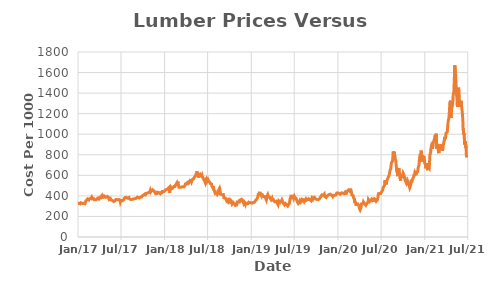
| Category | Series 1 |
|---|---|
| 2021-06-25 | 774 |
| 2021-06-24 | 837 |
| 2021-06-23 | 879 |
| 2021-06-22 | 866.4 |
| 2021-06-21 | 932.5 |
| 2021-06-18 | 897.9 |
| 2021-06-17 | 904.9 |
| 2021-06-16 | 967.9 |
| 2021-06-15 | 1009.9 |
| 2021-06-14 | 996.2 |
| 2021-06-11 | 1059.2 |
| 2021-06-10 | 1122.2 |
| 2021-06-09 | 1164.2 |
| 2021-06-08 | 1167 |
| 2021-06-07 | 1221.2 |
| 2021-06-04 | 1284.2 |
| 2021-06-03 | 1326.2 |
| 2021-06-02 | 1330.5 |
| 2021-06-01 | 1267.5 |
| 2021-05-28 | 1309.5 |
| 2021-05-27 | 1323 |
| 2021-05-26 | 1339.4 |
| 2021-05-25 | 1397 |
| 2021-05-24 | 1439 |
| 2021-05-21 | 1453 |
| 2021-05-20 | 1390 |
| 2021-05-19 | 1327 |
| 2021-05-18 | 1264 |
| 2021-05-17 | 1327 |
| 2021-05-14 | 1390 |
| 2021-05-13 | 1453 |
| 2021-05-12 | 1495 |
| 2021-05-11 | 1544.5 |
| 2021-05-10 | 1607.5 |
| 2021-05-07 | 1670.5 |
| 2021-05-06 | 1607.5 |
| 2021-05-05 | 1544.5 |
| 2021-05-04 | 1481.5 |
| 2021-05-03 | 1418.5 |
| 2021-04-30 | 1376.5 |
| 2021-04-29 | 1328.5 |
| 2021-04-28 | 1296.5 |
| 2021-04-27 | 1281 |
| 2021-04-26 | 1286.6 |
| 2021-04-23 | 1238.6 |
| 2021-04-22 | 1190.6 |
| 2021-04-21 | 1158.6 |
| 2021-04-20 | 1278.7 |
| 2021-04-19 | 1326.7 |
| 2021-04-16 | 1294.7 |
| 2021-04-15 | 1260.7 |
| 2021-04-14 | 1212.7 |
| 2021-04-13 | 1180.7 |
| 2021-04-12 | 1157.5 |
| 2021-04-09 | 1125.5 |
| 2021-04-08 | 1106.4 |
| 2021-04-07 | 1074.4 |
| 2021-04-06 | 1044.3 |
| 2021-04-05 | 1021 |
| 2021-04-01 | 1012.6 |
| 2021-03-31 | 1009.1 |
| 2021-03-30 | 989.6 |
| 2021-03-29 | 965.2 |
| 2021-03-26 | 953 |
| 2021-03-25 | 973.5 |
| 2021-03-24 | 945.8 |
| 2021-03-23 | 942.4 |
| 2021-03-22 | 926.2 |
| 2021-03-19 | 886.6 |
| 2021-03-18 | 854.6 |
| 2021-03-17 | 854.2 |
| 2021-03-16 | 840 |
| 2021-03-15 | 862.5 |
| 2021-03-12 | 867.1 |
| 2021-03-11 | 872 |
| 2021-03-10 | 903.7 |
| 2021-03-09 | 909.1 |
| 2021-03-08 | 878.9 |
| 2021-03-05 | 880 |
| 2021-03-04 | 866 |
| 2021-03-03 | 844.7 |
| 2021-03-02 | 836.1 |
| 2021-03-01 | 815.7 |
| 2021-02-26 | 847.7 |
| 2021-02-25 | 878.3 |
| 2021-02-24 | 906.4 |
| 2021-02-23 | 890.1 |
| 2021-02-22 | 890.2 |
| 2021-02-19 | 858.2 |
| 2021-02-18 | 1004.5 |
| 2021-02-17 | 986.8 |
| 2021-02-16 | 992.4 |
| 2021-02-12 | 982.1 |
| 2021-02-11 | 979 |
| 2021-02-10 | 950.8 |
| 2021-02-09 | 947 |
| 2021-02-08 | 940 |
| 2021-02-05 | 915.6 |
| 2021-02-04 | 883.6 |
| 2021-02-03 | 884 |
| 2021-02-02 | 857.4 |
| 2021-02-01 | 870.8 |
| 2021-01-29 | 887 |
| 2021-01-28 | 892.6 |
| 2021-01-27 | 865 |
| 2021-01-26 | 855.1 |
| 2021-01-25 | 823.1 |
| 2021-01-22 | 796 |
| 2021-01-21 | 748 |
| 2021-01-20 | 700 |
| 2021-01-19 | 668 |
| 2021-01-15 | 662.9 |
| 2021-01-14 | 683 |
| 2021-01-13 | 671.5 |
| 2021-01-12 | 649.9 |
| 2021-01-11 | 666.7 |
| 2021-01-08 | 690 |
| 2021-01-07 | 718 |
| 2021-01-06 | 703.3 |
| 2021-01-05 | 668.6 |
| 2021-01-04 | 700.6 |
| 2020-12-31 | 716.9 |
| 2020-12-30 | 745 |
| 2020-12-29 | 777 |
| 2020-12-28 | 775 |
| 2020-12-24 | 783.8 |
| 2020-12-23 | 772.4 |
| 2020-12-22 | 783.8 |
| 2020-12-21 | 766.2 |
| 2020-12-18 | 734.2 |
| 2020-12-17 | 840.1 |
| 2020-12-16 | 818.6 |
| 2020-12-15 | 826 |
| 2020-12-14 | 813 |
| 2020-12-11 | 795 |
| 2020-12-10 | 786.5 |
| 2020-12-09 | 754.5 |
| 2020-12-08 | 725.2 |
| 2020-12-07 | 696.8 |
| 2020-12-04 | 678.6 |
| 2020-12-03 | 660 |
| 2020-12-02 | 649 |
| 2020-12-01 | 635.2 |
| 2020-11-30 | 636.8 |
| 2020-11-27 | 630.9 |
| 2020-11-25 | 617.1 |
| 2020-11-24 | 600.5 |
| 2020-11-23 | 618.4 |
| 2020-11-20 | 630.1 |
| 2020-11-19 | 616.9 |
| 2020-11-18 | 595.7 |
| 2020-11-17 | 610.6 |
| 2020-11-16 | 593.5 |
| 2020-11-13 | 578.3 |
| 2020-11-12 | 576.3 |
| 2020-11-11 | 572.3 |
| 2020-11-10 | 580.3 |
| 2020-11-09 | 556.8 |
| 2020-11-06 | 524.8 |
| 2020-11-05 | 555.7 |
| 2020-11-04 | 539.1 |
| 2020-11-03 | 526.1 |
| 2020-11-02 | 502.8 |
| 2020-10-30 | 493.4 |
| 2020-10-29 | 478.3 |
| 2020-10-28 | 482.4 |
| 2020-10-27 | 484 |
| 2020-10-26 | 503 |
| 2020-10-23 | 515.3 |
| 2020-10-22 | 531.4 |
| 2020-10-21 | 522 |
| 2020-10-20 | 531.7 |
| 2020-10-19 | 550.7 |
| 2020-10-16 | 534 |
| 2020-10-15 | 537.7 |
| 2020-10-14 | 548.9 |
| 2020-10-13 | 535.4 |
| 2020-10-12 | 535.8 |
| 2020-10-09 | 557.3 |
| 2020-10-08 | 586.3 |
| 2020-10-07 | 567.3 |
| 2020-10-06 | 583.1 |
| 2020-10-05 | 602.1 |
| 2020-10-02 | 603 |
| 2020-10-01 | 622 |
| 2020-09-30 | 612.2 |
| 2020-09-29 | 602.2 |
| 2020-09-28 | 578.6 |
| 2020-09-25 | 607.6 |
| 2020-09-24 | 578.6 |
| 2020-09-23 | 607.6 |
| 2020-09-22 | 578.6 |
| 2020-09-21 | 549.6 |
| 2020-09-18 | 578.6 |
| 2020-09-17 | 597.6 |
| 2020-09-16 | 612 |
| 2020-09-15 | 640.4 |
| 2020-09-14 | 669.4 |
| 2020-09-11 | 640.4 |
| 2020-09-10 | 611.4 |
| 2020-09-09 | 592.4 |
| 2020-09-08 | 612.5 |
| 2020-09-04 | 641.5 |
| 2020-09-03 | 670.5 |
| 2020-09-02 | 699.5 |
| 2020-09-01 | 728.5 |
| 2020-08-31 | 747.5 |
| 2020-08-28 | 766.5 |
| 2020-08-27 | 794.8 |
| 2020-08-26 | 765.8 |
| 2020-08-25 | 829.3 |
| 2020-08-24 | 810.3 |
| 2020-08-21 | 830.9 |
| 2020-08-20 | 801.9 |
| 2020-08-19 | 782.9 |
| 2020-08-18 | 754 |
| 2020-08-17 | 735 |
| 2020-08-14 | 726.5 |
| 2020-08-13 | 725 |
| 2020-08-12 | 706 |
| 2020-08-11 | 681.5 |
| 2020-08-10 | 662.5 |
| 2020-08-07 | 648 |
| 2020-08-06 | 641.6 |
| 2020-08-05 | 622.6 |
| 2020-08-04 | 610.9 |
| 2020-08-03 | 596.2 |
| 2020-07-31 | 585.8 |
| 2020-07-30 | 580.4 |
| 2020-07-29 | 585 |
| 2020-07-28 | 566.9 |
| 2020-07-27 | 567.9 |
| 2020-07-24 | 541.4 |
| 2020-07-23 | 522.4 |
| 2020-07-22 | 510.5 |
| 2020-07-21 | 513.2 |
| 2020-07-20 | 532.2 |
| 2020-07-17 | 550.8 |
| 2020-07-16 | 524.2 |
| 2020-07-15 | 505.2 |
| 2020-07-14 | 511.5 |
| 2020-07-13 | 493.7 |
| 2020-07-10 | 498.4 |
| 2020-07-09 | 481.9 |
| 2020-07-08 | 469.4 |
| 2020-07-07 | 455.3 |
| 2020-07-06 | 453.2 |
| 2020-07-02 | 438.3 |
| 2020-07-01 | 432 |
| 2020-06-30 | 431.6 |
| 2020-06-29 | 423.4 |
| 2020-06-26 | 424.1 |
| 2020-06-25 | 429.5 |
| 2020-06-24 | 424.1 |
| 2020-06-23 | 433.7 |
| 2020-06-22 | 424.1 |
| 2020-06-19 | 421.4 |
| 2020-06-18 | 401.3 |
| 2020-06-17 | 382.3 |
| 2020-06-16 | 373.4 |
| 2020-06-15 | 361.3 |
| 2020-06-12 | 354.6 |
| 2020-06-11 | 351 |
| 2020-06-10 | 362 |
| 2020-06-09 | 357.6 |
| 2020-06-08 | 370.8 |
| 2020-06-05 | 368.8 |
| 2020-06-04 | 356.2 |
| 2020-06-03 | 348.1 |
| 2020-06-02 | 357 |
| 2020-06-01 | 362.3 |
| 2020-05-29 | 367.1 |
| 2020-05-28 | 368.3 |
| 2020-05-27 | 359.9 |
| 2020-05-26 | 356.8 |
| 2020-05-22 | 367.5 |
| 2020-05-21 | 370.3 |
| 2020-05-20 | 367.5 |
| 2020-05-19 | 354.3 |
| 2020-05-18 | 346.2 |
| 2020-05-15 | 345 |
| 2020-05-14 | 344.6 |
| 2020-05-13 | 348.5 |
| 2020-05-12 | 341 |
| 2020-05-11 | 353.8 |
| 2020-05-08 | 365 |
| 2020-05-07 | 346.1 |
| 2020-05-06 | 341.5 |
| 2020-05-05 | 336.2 |
| 2020-05-04 | 338.6 |
| 2020-05-01 | 328.5 |
| 2020-04-30 | 321.6 |
| 2020-04-29 | 312.5 |
| 2020-04-28 | 319.3 |
| 2020-04-27 | 308.4 |
| 2020-04-24 | 313 |
| 2020-04-23 | 317 |
| 2020-04-22 | 323 |
| 2020-04-21 | 317.5 |
| 2020-04-20 | 328.6 |
| 2020-04-17 | 341.7 |
| 2020-04-16 | 332.6 |
| 2020-04-15 | 324 |
| 2020-04-14 | 331 |
| 2020-04-13 | 333.7 |
| 2020-04-09 | 322.1 |
| 2020-04-08 | 304.1 |
| 2020-04-07 | 307.4 |
| 2020-04-06 | 282 |
| 2020-04-03 | 264 |
| 2020-04-02 | 264.1 |
| 2020-04-01 | 259.8 |
| 2020-03-31 | 278.5 |
| 2020-03-30 | 296.5 |
| 2020-03-27 | 311.3 |
| 2020-03-26 | 320.8 |
| 2020-03-25 | 311.6 |
| 2020-03-24 | 321.5 |
| 2020-03-23 | 320.2 |
| 2020-03-20 | 322.3 |
| 2020-03-19 | 319.8 |
| 2020-03-18 | 303.4 |
| 2020-03-17 | 310 |
| 2020-03-16 | 325 |
| 2020-03-13 | 343 |
| 2020-03-12 | 331 |
| 2020-03-11 | 349 |
| 2020-03-10 | 364.8 |
| 2020-03-09 | 356.7 |
| 2020-03-06 | 383.7 |
| 2020-03-05 | 401.7 |
| 2020-03-04 | 410.8 |
| 2020-03-03 | 406.3 |
| 2020-03-02 | 410.9 |
| 2020-02-28 | 410.9 |
| 2020-02-27 | 428 |
| 2020-02-26 | 445 |
| 2020-02-25 | 451.8 |
| 2020-02-24 | 459.5 |
| 2020-02-21 | 460.1 |
| 2020-02-20 | 463 |
| 2020-02-19 | 460.3 |
| 2020-02-18 | 446.1 |
| 2020-02-14 | 449.3 |
| 2020-02-13 | 455.1 |
| 2020-02-12 | 454.5 |
| 2020-02-11 | 451.4 |
| 2020-02-10 | 446 |
| 2020-02-07 | 440.2 |
| 2020-02-06 | 433.2 |
| 2020-02-05 | 428.3 |
| 2020-02-04 | 412.7 |
| 2020-02-03 | 422.8 |
| 2020-01-31 | 435.5 |
| 2020-01-30 | 436.1 |
| 2020-01-29 | 428 |
| 2020-01-28 | 427.1 |
| 2020-01-27 | 420.8 |
| 2020-01-24 | 426.2 |
| 2020-01-23 | 426 |
| 2020-01-22 | 425.2 |
| 2020-01-21 | 424.7 |
| 2020-01-17 | 430 |
| 2020-01-16 | 428.8 |
| 2020-01-15 | 426.5 |
| 2020-01-14 | 420.4 |
| 2020-01-13 | 422.6 |
| 2020-01-10 | 416.2 |
| 2020-01-09 | 416 |
| 2020-01-08 | 422.9 |
| 2020-01-07 | 418.3 |
| 2020-01-06 | 420.5 |
| 2020-01-03 | 427.6 |
| 2020-01-02 | 431.8 |
| 2019-12-31 | 426.2 |
| 2019-12-30 | 427.8 |
| 2019-12-27 | 427.9 |
| 2019-12-26 | 422.3 |
| 2019-12-24 | 420.9 |
| 2019-12-23 | 408.6 |
| 2019-12-20 | 413.3 |
| 2019-12-19 | 417.2 |
| 2019-12-18 | 406.8 |
| 2019-12-17 | 406.4 |
| 2019-12-16 | 410.8 |
| 2019-12-13 | 404.6 |
| 2019-12-12 | 397.8 |
| 2019-12-11 | 396.6 |
| 2019-12-10 | 392.7 |
| 2019-12-09 | 399.4 |
| 2019-12-06 | 406.1 |
| 2019-12-05 | 405.3 |
| 2019-12-04 | 400.7 |
| 2019-12-03 | 397.8 |
| 2019-12-02 | 409 |
| 2019-11-29 | 416.6 |
| 2019-11-27 | 416.1 |
| 2019-11-26 | 412.9 |
| 2019-11-25 | 421.3 |
| 2019-11-22 | 410.4 |
| 2019-11-21 | 408.2 |
| 2019-11-20 | 402.7 |
| 2019-11-19 | 413.4 |
| 2019-11-18 | 413 |
| 2019-11-15 | 396.4 |
| 2019-11-14 | 398.7 |
| 2019-11-13 | 387.9 |
| 2019-11-12 | 384.8 |
| 2019-11-11 | 391.7 |
| 2019-11-08 | 393 |
| 2019-11-07 | 393.3 |
| 2019-11-06 | 396 |
| 2019-11-05 | 405.1 |
| 2019-11-04 | 417.4 |
| 2019-11-01 | 412.8 |
| 2019-10-31 | 405.8 |
| 2019-10-30 | 407.1 |
| 2019-10-29 | 410 |
| 2019-10-28 | 406.9 |
| 2019-10-25 | 410 |
| 2019-10-24 | 403.7 |
| 2019-10-23 | 400.6 |
| 2019-10-22 | 395.8 |
| 2019-10-21 | 397.6 |
| 2019-10-18 | 385.6 |
| 2019-10-17 | 389.6 |
| 2019-10-16 | 379.9 |
| 2019-10-15 | 372.7 |
| 2019-10-14 | 380.5 |
| 2019-10-11 | 369.4 |
| 2019-10-10 | 363 |
| 2019-10-09 | 366.3 |
| 2019-10-08 | 362 |
| 2019-10-07 | 368.7 |
| 2019-10-04 | 365.7 |
| 2019-10-03 | 364.2 |
| 2019-10-02 | 359.8 |
| 2019-10-01 | 361.7 |
| 2019-09-30 | 367.1 |
| 2019-09-27 | 371.6 |
| 2019-09-26 | 372 |
| 2019-09-25 | 369.2 |
| 2019-09-24 | 373 |
| 2019-09-23 | 387.2 |
| 2019-09-20 | 383.8 |
| 2019-09-19 | 378.3 |
| 2019-09-18 | 382 |
| 2019-09-17 | 376.3 |
| 2019-09-16 | 367.6 |
| 2019-09-13 | 378.5 |
| 2019-09-12 | 380.5 |
| 2019-09-11 | 380.6 |
| 2019-09-10 | 372 |
| 2019-09-09 | 353 |
| 2019-09-06 | 353.6 |
| 2019-09-05 | 358.8 |
| 2019-09-04 | 362.3 |
| 2019-09-03 | 368.9 |
| 2019-08-30 | 372 |
| 2019-08-29 | 373.2 |
| 2019-08-28 | 379.3 |
| 2019-08-27 | 368.2 |
| 2019-08-26 | 363.3 |
| 2019-08-23 | 359.9 |
| 2019-08-22 | 359.3 |
| 2019-08-21 | 369.1 |
| 2019-08-20 | 366.2 |
| 2019-08-19 | 371.9 |
| 2019-08-16 | 362.9 |
| 2019-08-15 | 354.2 |
| 2019-08-14 | 348.1 |
| 2019-08-13 | 354.2 |
| 2019-08-12 | 342.8 |
| 2019-08-09 | 348.9 |
| 2019-08-08 | 363.6 |
| 2019-08-07 | 358 |
| 2019-08-06 | 369.6 |
| 2019-08-05 | 358 |
| 2019-08-02 | 368 |
| 2019-08-01 | 362.9 |
| 2019-07-31 | 343.9 |
| 2019-07-30 | 349 |
| 2019-07-29 | 335.8 |
| 2019-07-26 | 333.7 |
| 2019-07-25 | 340.1 |
| 2019-07-24 | 343.5 |
| 2019-07-23 | 332.7 |
| 2019-07-22 | 344 |
| 2019-07-19 | 353.7 |
| 2019-07-18 | 334.7 |
| 2019-07-17 | 327.1 |
| 2019-07-16 | 332.4 |
| 2019-07-15 | 336.6 |
| 2019-07-12 | 348.6 |
| 2019-07-11 | 355.8 |
| 2019-07-10 | 367 |
| 2019-07-09 | 368.7 |
| 2019-07-08 | 377.2 |
| 2019-07-05 | 383.9 |
| 2019-07-03 | 383.2 |
| 2019-07-02 | 391.1 |
| 2019-07-01 | 394.1 |
| 2019-06-28 | 375.1 |
| 2019-06-27 | 378.7 |
| 2019-06-26 | 383.9 |
| 2019-06-25 | 393.8 |
| 2019-06-24 | 392.1 |
| 2019-06-21 | 403.2 |
| 2019-06-20 | 384.2 |
| 2019-06-19 | 386.3 |
| 2019-06-18 | 410 |
| 2019-06-17 | 392.3 |
| 2019-06-14 | 386 |
| 2019-06-13 | 373.8 |
| 2019-06-12 | 354.8 |
| 2019-06-11 | 343.3 |
| 2019-06-10 | 324.3 |
| 2019-06-07 | 315.8 |
| 2019-06-06 | 314.4 |
| 2019-06-05 | 311.6 |
| 2019-06-04 | 316.4 |
| 2019-06-03 | 301.8 |
| 2019-05-31 | 305.5 |
| 2019-05-30 | 309.3 |
| 2019-05-29 | 316.2 |
| 2019-05-28 | 307.5 |
| 2019-05-24 | 326.5 |
| 2019-05-23 | 323.7 |
| 2019-05-22 | 319 |
| 2019-05-21 | 317.9 |
| 2019-05-20 | 313.6 |
| 2019-05-17 | 324 |
| 2019-05-16 | 328.1 |
| 2019-05-15 | 326.2 |
| 2019-05-14 | 335.9 |
| 2019-05-13 | 343.5 |
| 2019-05-10 | 358.5 |
| 2019-05-09 | 358.5 |
| 2019-05-08 | 346.1 |
| 2019-05-07 | 341.8 |
| 2019-05-06 | 347.9 |
| 2019-05-03 | 349.3 |
| 2019-05-02 | 348.5 |
| 2019-05-01 | 338 |
| 2019-04-30 | 343.7 |
| 2019-04-29 | 342.7 |
| 2019-04-26 | 350.7 |
| 2019-04-25 | 343.8 |
| 2019-04-24 | 330.1 |
| 2019-04-23 | 314.9 |
| 2019-04-22 | 323.6 |
| 2019-04-18 | 335.7 |
| 2019-04-17 | 338.9 |
| 2019-04-16 | 335.8 |
| 2019-04-15 | 348 |
| 2019-04-12 | 348.7 |
| 2019-04-11 | 340.3 |
| 2019-04-10 | 342.4 |
| 2019-04-09 | 340 |
| 2019-04-08 | 345.5 |
| 2019-04-05 | 352.8 |
| 2019-04-04 | 360.3 |
| 2019-04-03 | 365.2 |
| 2019-04-02 | 359.9 |
| 2019-04-01 | 365.7 |
| 2019-03-29 | 360.2 |
| 2019-03-28 | 374.9 |
| 2019-03-27 | 366.6 |
| 2019-03-26 | 369.2 |
| 2019-03-25 | 363 |
| 2019-03-22 | 368.3 |
| 2019-03-21 | 378.4 |
| 2019-03-20 | 381.1 |
| 2019-03-19 | 385.5 |
| 2019-03-18 | 390.6 |
| 2019-03-15 | 390.2 |
| 2019-03-14 | 386.8 |
| 2019-03-13 | 395.8 |
| 2019-03-12 | 399.3 |
| 2019-03-11 | 411.8 |
| 2019-03-08 | 396.8 |
| 2019-03-07 | 381.8 |
| 2019-03-06 | 370.5 |
| 2019-03-05 | 360.1 |
| 2019-03-04 | 367.4 |
| 2019-03-01 | 382.4 |
| 2019-02-28 | 391.4 |
| 2019-02-27 | 390.6 |
| 2019-02-26 | 393.2 |
| 2019-02-25 | 395.4 |
| 2019-02-22 | 393.5 |
| 2019-02-21 | 394.3 |
| 2019-02-20 | 389 |
| 2019-02-19 | 397.4 |
| 2019-02-15 | 408.3 |
| 2019-02-14 | 423.3 |
| 2019-02-13 | 416.4 |
| 2019-02-12 | 401.4 |
| 2019-02-11 | 404.1 |
| 2019-02-08 | 419.1 |
| 2019-02-07 | 424.5 |
| 2019-02-06 | 439.5 |
| 2019-02-05 | 438.9 |
| 2019-02-04 | 423.9 |
| 2019-02-01 | 419.2 |
| 2019-01-31 | 416.2 |
| 2019-01-30 | 416.5 |
| 2019-01-29 | 401.5 |
| 2019-01-28 | 389.7 |
| 2019-01-25 | 381.5 |
| 2019-01-24 | 381.1 |
| 2019-01-23 | 366.1 |
| 2019-01-22 | 363.4 |
| 2019-01-18 | 354.9 |
| 2019-01-17 | 359.4 |
| 2019-01-16 | 361.5 |
| 2019-01-15 | 353.4 |
| 2019-01-14 | 338.4 |
| 2019-01-11 | 343.2 |
| 2019-01-10 | 346.4 |
| 2019-01-09 | 336.3 |
| 2019-01-08 | 340.2 |
| 2019-01-07 | 330.8 |
| 2019-01-04 | 329.9 |
| 2019-01-03 | 329.5 |
| 2019-01-02 | 333.2 |
| 2018-12-31 | 337 |
| 2018-12-28 | 334 |
| 2018-12-27 | 336.4 |
| 2018-12-26 | 336.2 |
| 2018-12-24 | 338.4 |
| 2018-12-21 | 339.3 |
| 2018-12-20 | 334.8 |
| 2018-12-19 | 335.8 |
| 2018-12-18 | 325.3 |
| 2018-12-17 | 320.7 |
| 2018-12-14 | 321.6 |
| 2018-12-13 | 323.2 |
| 2018-12-12 | 322.2 |
| 2018-12-11 | 316.4 |
| 2018-12-10 | 317.1 |
| 2018-12-07 | 331.9 |
| 2018-12-06 | 319.5 |
| 2018-12-04 | 321.8 |
| 2018-12-03 | 334.8 |
| 2018-11-30 | 323.9 |
| 2018-11-29 | 329.7 |
| 2018-11-28 | 336.7 |
| 2018-11-27 | 346.2 |
| 2018-11-26 | 355.7 |
| 2018-11-23 | 362.3 |
| 2018-11-21 | 365.7 |
| 2018-11-20 | 356 |
| 2018-11-19 | 358.5 |
| 2018-11-16 | 351.4 |
| 2018-11-15 | 366.4 |
| 2018-11-14 | 356.3 |
| 2018-11-13 | 341.3 |
| 2018-11-12 | 353 |
| 2018-11-09 | 358.4 |
| 2018-11-08 | 349.5 |
| 2018-11-07 | 340.8 |
| 2018-11-06 | 350.3 |
| 2018-11-05 | 344.4 |
| 2018-11-02 | 341 |
| 2018-11-01 | 326 |
| 2018-10-31 | 311 |
| 2018-10-30 | 302.4 |
| 2018-10-29 | 303.3 |
| 2018-10-26 | 306.8 |
| 2018-10-25 | 305.7 |
| 2018-10-24 | 303 |
| 2018-10-23 | 314.3 |
| 2018-10-22 | 320 |
| 2018-10-19 | 328.5 |
| 2018-10-18 | 325.9 |
| 2018-10-17 | 333.9 |
| 2018-10-16 | 339.9 |
| 2018-10-15 | 325.2 |
| 2018-10-12 | 320.1 |
| 2018-10-11 | 324.2 |
| 2018-10-10 | 339.2 |
| 2018-10-09 | 349 |
| 2018-10-08 | 353.5 |
| 2018-10-05 | 350.3 |
| 2018-10-04 | 361.4 |
| 2018-10-03 | 353.6 |
| 2018-10-02 | 346.3 |
| 2018-10-01 | 337.4 |
| 2018-09-28 | 344.4 |
| 2018-09-27 | 359.4 |
| 2018-09-26 | 351 |
| 2018-09-25 | 336.9 |
| 2018-09-24 | 339.6 |
| 2018-09-21 | 340.3 |
| 2018-09-20 | 345 |
| 2018-09-19 | 347.2 |
| 2018-09-18 | 348.1 |
| 2018-09-17 | 363.1 |
| 2018-09-14 | 370 |
| 2018-09-13 | 378.5 |
| 2018-09-12 | 373.9 |
| 2018-09-11 | 382.5 |
| 2018-09-10 | 383.3 |
| 2018-09-07 | 382.5 |
| 2018-09-06 | 397.5 |
| 2018-09-05 | 412.4 |
| 2018-09-04 | 419 |
| 2018-08-31 | 411.8 |
| 2018-08-30 | 402.6 |
| 2018-08-29 | 411.4 |
| 2018-08-28 | 420.4 |
| 2018-08-27 | 412.8 |
| 2018-08-24 | 415.2 |
| 2018-08-23 | 413.9 |
| 2018-08-22 | 458.6 |
| 2018-08-21 | 467.9 |
| 2018-08-20 | 475.8 |
| 2018-08-17 | 472.5 |
| 2018-08-16 | 457.5 |
| 2018-08-15 | 442.5 |
| 2018-08-14 | 444.9 |
| 2018-08-13 | 429.9 |
| 2018-08-10 | 414.9 |
| 2018-08-09 | 410.7 |
| 2018-08-08 | 411.4 |
| 2018-08-07 | 426.4 |
| 2018-08-06 | 422.7 |
| 2018-08-03 | 430.5 |
| 2018-08-02 | 425.4 |
| 2018-08-01 | 440.4 |
| 2018-07-31 | 455.4 |
| 2018-07-30 | 445.5 |
| 2018-07-27 | 463.3 |
| 2018-07-26 | 478.3 |
| 2018-07-25 | 493.3 |
| 2018-07-24 | 488.5 |
| 2018-07-23 | 477.3 |
| 2018-07-20 | 485.8 |
| 2018-07-19 | 484.9 |
| 2018-07-18 | 499.9 |
| 2018-07-17 | 514.9 |
| 2018-07-16 | 519.6 |
| 2018-07-13 | 520.7 |
| 2018-07-12 | 520.1 |
| 2018-07-11 | 521.8 |
| 2018-07-10 | 532.3 |
| 2018-07-09 | 530 |
| 2018-07-06 | 538.3 |
| 2018-07-05 | 541 |
| 2018-07-03 | 545.2 |
| 2018-07-02 | 557.5 |
| 2018-06-29 | 552.5 |
| 2018-06-28 | 540.8 |
| 2018-06-27 | 536.5 |
| 2018-06-26 | 545.8 |
| 2018-06-25 | 564.1 |
| 2018-06-22 | 560.1 |
| 2018-06-21 | 547 |
| 2018-06-20 | 532 |
| 2018-06-19 | 528.2 |
| 2018-06-18 | 543.2 |
| 2018-06-15 | 558.2 |
| 2018-06-14 | 566.3 |
| 2018-06-13 | 554.6 |
| 2018-06-12 | 569.6 |
| 2018-06-11 | 579.6 |
| 2018-06-08 | 589.6 |
| 2018-06-07 | 599.5 |
| 2018-06-06 | 592.7 |
| 2018-06-05 | 588.8 |
| 2018-06-04 | 588.4 |
| 2018-06-01 | 593.6 |
| 2018-05-31 | 597.1 |
| 2018-05-30 | 599.1 |
| 2018-05-29 | 609.1 |
| 2018-05-25 | 599.3 |
| 2018-05-24 | 589.3 |
| 2018-05-23 | 579.3 |
| 2018-05-22 | 594 |
| 2018-05-21 | 609 |
| 2018-05-18 | 624 |
| 2018-05-17 | 639 |
| 2018-05-16 | 629 |
| 2018-05-15 | 619 |
| 2018-05-14 | 612.7 |
| 2018-05-11 | 602.7 |
| 2018-05-10 | 592.7 |
| 2018-05-09 | 591.2 |
| 2018-05-08 | 592.4 |
| 2018-05-07 | 586.5 |
| 2018-05-04 | 576.5 |
| 2018-05-03 | 566.5 |
| 2018-05-02 | 575.1 |
| 2018-05-01 | 572.1 |
| 2018-04-30 | 562.1 |
| 2018-04-27 | 557.9 |
| 2018-04-26 | 552.2 |
| 2018-04-25 | 545.4 |
| 2018-04-24 | 556.6 |
| 2018-04-23 | 546.7 |
| 2018-04-20 | 548.6 |
| 2018-04-19 | 552.2 |
| 2018-04-18 | 550.7 |
| 2018-04-17 | 542.1 |
| 2018-04-16 | 535.8 |
| 2018-04-13 | 526.8 |
| 2018-04-12 | 524.3 |
| 2018-04-11 | 523.1 |
| 2018-04-10 | 533.1 |
| 2018-04-09 | 534.2 |
| 2018-04-06 | 536.2 |
| 2018-04-05 | 536.4 |
| 2018-04-04 | 526.4 |
| 2018-04-03 | 516.4 |
| 2018-04-02 | 512.7 |
| 2018-03-29 | 515.7 |
| 2018-03-28 | 505.9 |
| 2018-03-27 | 505.9 |
| 2018-03-26 | 497.1 |
| 2018-03-23 | 487.6 |
| 2018-03-22 | 484.8 |
| 2018-03-21 | 482.8 |
| 2018-03-20 | 489.7 |
| 2018-03-19 | 486.6 |
| 2018-03-16 | 489.1 |
| 2018-03-15 | 494.4 |
| 2018-03-14 | 484.4 |
| 2018-03-13 | 485.2 |
| 2018-03-12 | 486.4 |
| 2018-03-09 | 483.4 |
| 2018-03-08 | 477 |
| 2018-03-07 | 478.6 |
| 2018-03-06 | 488.6 |
| 2018-03-05 | 479.5 |
| 2018-03-02 | 483.8 |
| 2018-03-01 | 491.7 |
| 2018-02-28 | 501.7 |
| 2018-02-27 | 523 |
| 2018-02-26 | 515.1 |
| 2018-02-23 | 515.4 |
| 2018-02-22 | 515.9 |
| 2018-02-21 | 526.4 |
| 2018-02-20 | 516.8 |
| 2018-02-16 | 507.8 |
| 2018-02-15 | 500.7 |
| 2018-02-14 | 500.6 |
| 2018-02-13 | 491.5 |
| 2018-02-12 | 485.5 |
| 2018-02-09 | 483 |
| 2018-02-08 | 491.9 |
| 2018-02-07 | 493.7 |
| 2018-02-06 | 484 |
| 2018-02-05 | 477.9 |
| 2018-02-02 | 483.7 |
| 2018-02-01 | 475.1 |
| 2018-01-31 | 470.9 |
| 2018-01-30 | 467.8 |
| 2018-01-29 | 477.8 |
| 2018-01-26 | 487.3 |
| 2018-01-25 | 478 |
| 2018-01-24 | 472.9 |
| 2018-01-23 | 471.9 |
| 2018-01-22 | 428.9 |
| 2018-01-19 | 429.8 |
| 2018-01-18 | 479.5 |
| 2018-01-17 | 476.4 |
| 2018-01-16 | 474.7 |
| 2018-01-12 | 466.1 |
| 2018-01-11 | 463.8 |
| 2018-01-10 | 460.7 |
| 2018-01-09 | 456.7 |
| 2018-01-08 | 459.9 |
| 2018-01-05 | 459.1 |
| 2018-01-04 | 454.1 |
| 2018-01-03 | 452.6 |
| 2018-01-02 | 449.5 |
| 2017-12-29 | 441.9 |
| 2017-12-28 | 444.1 |
| 2017-12-27 | 444.4 |
| 2017-12-26 | 444.4 |
| 2017-12-22 | 442.8 |
| 2017-12-21 | 435.9 |
| 2017-12-20 | 430.6 |
| 2017-12-19 | 431.2 |
| 2017-12-18 | 434.9 |
| 2017-12-15 | 431.9 |
| 2017-12-14 | 430.7 |
| 2017-12-13 | 421.1 |
| 2017-12-12 | 423.5 |
| 2017-12-11 | 429.9 |
| 2017-12-08 | 429.7 |
| 2017-12-07 | 425.9 |
| 2017-12-06 | 424.4 |
| 2017-12-05 | 422.5 |
| 2017-12-04 | 432.5 |
| 2017-12-01 | 435.4 |
| 2017-11-30 | 427.7 |
| 2017-11-29 | 421.8 |
| 2017-11-28 | 426.2 |
| 2017-11-27 | 416.2 |
| 2017-11-24 | 420.7 |
| 2017-11-22 | 427.5 |
| 2017-11-21 | 431.3 |
| 2017-11-20 | 429.7 |
| 2017-11-17 | 439.7 |
| 2017-11-16 | 449.7 |
| 2017-11-15 | 449.4 |
| 2017-11-14 | 452.5 |
| 2017-11-13 | 456.3 |
| 2017-11-10 | 459.6 |
| 2017-11-09 | 455.4 |
| 2017-11-08 | 455.8 |
| 2017-11-07 | 457.1 |
| 2017-11-06 | 449.6 |
| 2017-11-03 | 439.6 |
| 2017-11-02 | 443.6 |
| 2017-11-01 | 453.6 |
| 2017-10-31 | 444 |
| 2017-10-30 | 438.7 |
| 2017-10-27 | 444.2 |
| 2017-10-26 | 435.3 |
| 2017-10-25 | 432.6 |
| 2017-10-24 | 433.7 |
| 2017-10-23 | 435.6 |
| 2017-10-20 | 427.5 |
| 2017-10-19 | 426.7 |
| 2017-10-18 | 423.7 |
| 2017-10-17 | 428.5 |
| 2017-10-16 | 429.8 |
| 2017-10-13 | 424.3 |
| 2017-10-12 | 417.2 |
| 2017-10-11 | 409.2 |
| 2017-10-10 | 407.3 |
| 2017-10-09 | 413.7 |
| 2017-10-06 | 412.1 |
| 2017-10-05 | 408.9 |
| 2017-10-04 | 408.8 |
| 2017-10-03 | 410.4 |
| 2017-10-02 | 406.8 |
| 2017-09-29 | 402.2 |
| 2017-09-28 | 402.4 |
| 2017-09-27 | 393.5 |
| 2017-09-26 | 388.9 |
| 2017-09-25 | 390 |
| 2017-09-22 | 393.1 |
| 2017-09-21 | 388.4 |
| 2017-09-20 | 390 |
| 2017-09-19 | 381.8 |
| 2017-09-18 | 379.2 |
| 2017-09-15 | 379.2 |
| 2017-09-14 | 378.9 |
| 2017-09-13 | 378.9 |
| 2017-09-12 | 376.1 |
| 2017-09-11 | 378.1 |
| 2017-09-08 | 388.1 |
| 2017-09-07 | 382.9 |
| 2017-09-06 | 379.3 |
| 2017-09-05 | 384.2 |
| 2017-09-01 | 374.2 |
| 2017-08-31 | 371.8 |
| 2017-08-30 | 366.3 |
| 2017-08-29 | 376.3 |
| 2017-08-28 | 380.1 |
| 2017-08-25 | 372 |
| 2017-08-24 | 373.9 |
| 2017-08-23 | 365.9 |
| 2017-08-22 | 367.6 |
| 2017-08-21 | 365.3 |
| 2017-08-18 | 366.3 |
| 2017-08-17 | 371.3 |
| 2017-08-16 | 370.3 |
| 2017-08-15 | 373.6 |
| 2017-08-14 | 370.3 |
| 2017-08-11 | 365.4 |
| 2017-08-10 | 365.5 |
| 2017-08-09 | 368 |
| 2017-08-08 | 368 |
| 2017-08-07 | 367.6 |
| 2017-08-04 | 373.8 |
| 2017-08-03 | 383.8 |
| 2017-08-02 | 384.7 |
| 2017-08-01 | 380.9 |
| 2017-07-31 | 378.3 |
| 2017-07-28 | 377.7 |
| 2017-07-27 | 381.4 |
| 2017-07-26 | 377.5 |
| 2017-07-25 | 377.2 |
| 2017-07-24 | 378.9 |
| 2017-07-21 | 386.7 |
| 2017-07-20 | 388.6 |
| 2017-07-19 | 388.8 |
| 2017-07-18 | 385.5 |
| 2017-07-17 | 387.3 |
| 2017-07-14 | 377.3 |
| 2017-07-13 | 367.4 |
| 2017-07-12 | 371.2 |
| 2017-07-11 | 369.1 |
| 2017-07-10 | 360.2 |
| 2017-07-07 | 352.8 |
| 2017-07-06 | 352.8 |
| 2017-07-05 | 354.4 |
| 2017-07-03 | 357.7 |
| 2017-06-30 | 356.1 |
| 2017-06-29 | 352.5 |
| 2017-06-28 | 342.5 |
| 2017-06-27 | 353.6 |
| 2017-06-26 | 360.9 |
| 2017-06-23 | 363.7 |
| 2017-06-22 | 363 |
| 2017-06-21 | 360.1 |
| 2017-06-20 | 363.6 |
| 2017-06-19 | 368.2 |
| 2017-06-16 | 363.4 |
| 2017-06-15 | 365.5 |
| 2017-06-14 | 368 |
| 2017-06-13 | 368.9 |
| 2017-06-12 | 370.2 |
| 2017-06-09 | 364.4 |
| 2017-06-08 | 363.6 |
| 2017-06-07 | 357.9 |
| 2017-06-06 | 355 |
| 2017-06-05 | 351.6 |
| 2017-06-02 | 353.5 |
| 2017-06-01 | 353.2 |
| 2017-05-31 | 345.1 |
| 2017-05-30 | 346.8 |
| 2017-05-26 | 354.2 |
| 2017-05-25 | 353 |
| 2017-05-24 | 361.6 |
| 2017-05-23 | 362.7 |
| 2017-05-22 | 363.3 |
| 2017-05-19 | 363 |
| 2017-05-18 | 367.7 |
| 2017-05-17 | 373.7 |
| 2017-05-16 | 371.7 |
| 2017-05-15 | 373.4 |
| 2017-05-12 | 364.2 |
| 2017-05-11 | 372.6 |
| 2017-05-10 | 374.4 |
| 2017-05-09 | 384.4 |
| 2017-05-08 | 387.5 |
| 2017-05-05 | 388.8 |
| 2017-05-04 | 395.1 |
| 2017-05-03 | 390.1 |
| 2017-05-02 | 390.8 |
| 2017-05-01 | 392.2 |
| 2017-04-28 | 386.1 |
| 2017-04-27 | 386 |
| 2017-04-26 | 385 |
| 2017-04-25 | 392.9 |
| 2017-04-24 | 395.1 |
| 2017-04-21 | 398.5 |
| 2017-04-20 | 388.8 |
| 2017-04-19 | 387.4 |
| 2017-04-18 | 385 |
| 2017-04-17 | 386.7 |
| 2017-04-13 | 385 |
| 2017-04-12 | 393.5 |
| 2017-04-11 | 403.5 |
| 2017-04-10 | 393.8 |
| 2017-04-07 | 399.6 |
| 2017-04-06 | 389.6 |
| 2017-04-05 | 379.6 |
| 2017-04-04 | 373.1 |
| 2017-04-03 | 374 |
| 2017-03-31 | 381.4 |
| 2017-03-30 | 375.4 |
| 2017-03-29 | 369.2 |
| 2017-03-28 | 369.2 |
| 2017-03-27 | 372.6 |
| 2017-03-24 | 376.6 |
| 2017-03-23 | 376.7 |
| 2017-03-22 | 373.3 |
| 2017-03-21 | 370.2 |
| 2017-03-20 | 371 |
| 2017-03-17 | 361.8 |
| 2017-03-16 | 363.5 |
| 2017-03-15 | 365.5 |
| 2017-03-14 | 359.5 |
| 2017-03-13 | 359.7 |
| 2017-03-10 | 362.5 |
| 2017-03-09 | 361.5 |
| 2017-03-08 | 369.6 |
| 2017-03-07 | 374.4 |
| 2017-03-06 | 371.6 |
| 2017-03-03 | 370.6 |
| 2017-03-02 | 370.4 |
| 2017-03-01 | 374.9 |
| 2017-02-28 | 378.8 |
| 2017-02-27 | 388.5 |
| 2017-02-24 | 379.6 |
| 2017-02-23 | 375.5 |
| 2017-02-22 | 375.2 |
| 2017-02-21 | 372 |
| 2017-02-17 | 371.1 |
| 2017-02-16 | 371.1 |
| 2017-02-15 | 361.3 |
| 2017-02-14 | 365.7 |
| 2017-02-13 | 365.4 |
| 2017-02-10 | 370.5 |
| 2017-02-09 | 375.4 |
| 2017-02-08 | 371.9 |
| 2017-02-07 | 361.9 |
| 2017-02-06 | 360.1 |
| 2017-02-03 | 350.6 |
| 2017-02-02 | 347.9 |
| 2017-02-01 | 337.9 |
| 2017-01-31 | 330 |
| 2017-01-30 | 324.2 |
| 2017-01-27 | 328.4 |
| 2017-01-26 | 332 |
| 2017-01-25 | 328.7 |
| 2017-01-24 | 320.8 |
| 2017-01-23 | 321.5 |
| 2017-01-20 | 325.5 |
| 2017-01-19 | 325.6 |
| 2017-01-18 | 326.8 |
| 2017-01-17 | 334.7 |
| 2017-01-13 | 333.3 |
| 2017-01-12 | 326.8 |
| 2017-01-11 | 328.8 |
| 2017-01-10 | 322.6 |
| 2017-01-09 | 322.1 |
| 2017-01-06 | 328.2 |
| 2017-01-05 | 328.6 |
| 2017-01-04 | 327.9 |
| 2017-01-03 | 329.1 |
| 2016-12-30 | 329.4 |
| 2016-12-29 | 324.5 |
| 2016-12-28 | 322.5 |
| 2016-12-27 | 316.3 |
| 2016-12-23 | 318.6 |
| 2016-12-22 | 318.2 |
| 2016-12-21 | 320.3 |
| 2016-12-20 | 319.9 |
| 2016-12-19 | 316.9 |
| 2016-12-16 | 309.3 |
| 2016-12-15 | 321.6 |
| 2016-12-14 | 313.5 |
| 2016-12-13 | 316 |
| 2016-12-12 | 315.5 |
| 2016-12-09 | 317.3 |
| 2016-12-08 | 322.8 |
| 2016-12-07 | 328.7 |
| 2016-12-06 | 331.4 |
| 2016-12-05 | 332.9 |
| 2016-12-02 | 337.2 |
| 2016-12-01 | 331.1 |
| 2016-11-30 | 329.8 |
| 2016-11-29 | 330.3 |
| 2016-11-28 | 337.9 |
| 2016-11-25 | 334.4 |
| 2016-11-23 | 324.4 |
| 2016-11-22 | 322.5 |
| 2016-11-21 | 321.5 |
| 2016-11-18 | 320.7 |
| 2016-11-17 | 323.1 |
| 2016-11-16 | 315.6 |
| 2016-11-15 | 312.9 |
| 2016-11-14 | 313.4 |
| 2016-11-11 | 319.8 |
| 2016-11-10 | 316.7 |
| 2016-11-09 | 316 |
| 2016-11-08 | 311.2 |
| 2016-11-07 | 311.9 |
| 2016-11-04 | 312.2 |
| 2016-11-03 | 311.1 |
| 2016-11-02 | 308.5 |
| 2016-11-01 | 308.3 |
| 2016-10-31 | 309.2 |
| 2016-10-28 | 311.1 |
| 2016-10-27 | 315.1 |
| 2016-10-26 | 316.7 |
| 2016-10-25 | 318.8 |
| 2016-10-24 | 319.6 |
| 2016-10-21 | 320.2 |
| 2016-10-20 | 321.7 |
| 2016-10-19 | 326.6 |
| 2016-10-18 | 322.7 |
| 2016-10-17 | 315 |
| 2016-10-14 | 323.4 |
| 2016-10-13 | 328 |
| 2016-10-12 | 334.6 |
| 2016-10-11 | 332.3 |
| 2016-10-10 | 342.3 |
| 2016-10-07 | 343.1 |
| 2016-10-06 | 336 |
| 2016-10-05 | 331.7 |
| 2016-10-04 | 330.3 |
| 2016-10-03 | 334.9 |
| 2016-09-30 | 336.4 |
| 2016-09-29 | 330.1 |
| 2016-09-28 | 325.6 |
| 2016-09-27 | 326.2 |
| 2016-09-26 | 327.1 |
| 2016-09-23 | 327.1 |
| 2016-09-22 | 325.4 |
| 2016-09-21 | 315.4 |
| 2016-09-20 | 306.3 |
| 2016-09-19 | 305.6 |
| 2016-09-16 | 303.9 |
| 2016-09-15 | 301 |
| 2016-09-14 | 307.6 |
| 2016-09-13 | 307.8 |
| 2016-09-12 | 311.4 |
| 2016-09-09 | 309.4 |
| 2016-09-08 | 308.2 |
| 2016-09-07 | 311.4 |
| 2016-09-06 | 313.6 |
| 2016-09-02 | 313.6 |
| 2016-09-01 | 305.8 |
| 2016-08-31 | 311.1 |
| 2016-08-30 | 319.1 |
| 2016-08-29 | 319.8 |
| 2016-08-26 | 322.7 |
| 2016-08-25 | 329.7 |
| 2016-08-24 | 335.4 |
| 2016-08-23 | 336.2 |
| 2016-08-22 | 325 |
| 2016-08-19 | 323.2 |
| 2016-08-18 | 322.3 |
| 2016-08-17 | 320.3 |
| 2016-08-16 | 323 |
| 2016-08-15 | 323.3 |
| 2016-08-12 | 324.6 |
| 2016-08-11 | 324.1 |
| 2016-08-10 | 322.6 |
| 2016-08-09 | 330.7 |
| 2016-08-08 | 332.2 |
| 2016-08-05 | 322.2 |
| 2016-08-04 | 322.6 |
| 2016-08-03 | 317.1 |
| 2016-08-02 | 315 |
| 2016-08-01 | 314.9 |
| 2016-07-29 | 314.4 |
| 2016-07-28 | 318.4 |
| 2016-07-27 | 325.7 |
| 2016-07-26 | 328.3 |
| 2016-07-25 | 330.2 |
| 2016-07-22 | 329.7 |
| 2016-07-21 | 329.1 |
| 2016-07-20 | 329.9 |
| 2016-07-19 | 327.6 |
| 2016-07-18 | 325.7 |
| 2016-07-15 | 328.3 |
| 2016-07-14 | 336.2 |
| 2016-07-13 | 333.3 |
| 2016-07-12 | 324.5 |
| 2016-07-11 | 322.2 |
| 2016-07-08 | 319.2 |
| 2016-07-07 | 318.8 |
| 2016-07-06 | 321.6 |
| 2016-07-05 | 322.8 |
| 2016-07-01 | 315 |
| 2016-06-30 | 307.7 |
| 2016-06-29 | 307.7 |
| 2016-06-28 | 302.9 |
| 2016-06-27 | 298.2 |